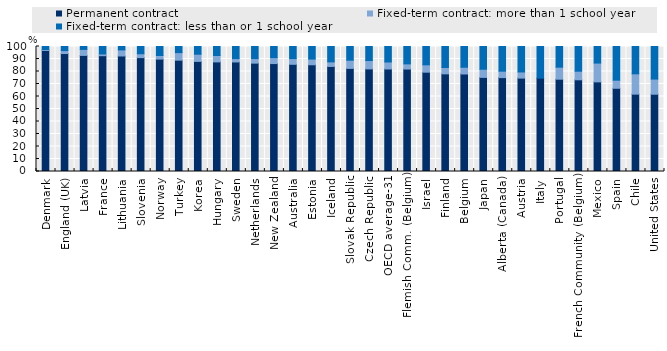
| Category | Permanent contract | Fixed-term contract: more than 1 school year | Fixed-term contract: less than or 1 school year |
|---|---|---|---|
| Denmark | 96.841 | 0.744 | 2.414 |
| England (UK) | 94.371 | 2.346 | 3.282 |
| Latvia | 92.878 | 4.8 | 2.322 |
| France | 92.647 | 1.362 | 5.991 |
| Lithuania | 92.425 | 4.855 | 2.721 |
| Slovenia | 91.095 | 3.094 | 5.811 |
| Norway | 89.931 | 2.869 | 7.2 |
| Turkey | 89.066 | 6.029 | 4.905 |
| Korea | 88.087 | 5.735 | 6.179 |
| Hungary | 87.682 | 5.118 | 7.2 |
| Sweden | 87.63 | 2.702 | 9.668 |
| Netherlands | 86.676 | 3.675 | 9.65 |
| New Zealand | 86.355 | 4.751 | 8.894 |
| Australia | 85.765 | 4.574 | 9.661 |
| Estonia | 85.378 | 4.577 | 10.045 |
| Iceland | 84.048 | 3.653 | 12.299 |
| Slovak Republic | 82.466 | 6.571 | 10.963 |
| Czech Republic | 82.079 | 6.671 | 11.25 |
| OECD average-31 | 82.017 | 5.6 | 12.384 |
| Flemish Comm. (Belgium) | 81.967 | 4.136 | 13.897 |
| Israel | 79.454 | 5.88 | 14.666 |
| Finland | 78.123 | 5.088 | 16.789 |
| Belgium | 78.004 | 5.396 | 16.6 |
| Japan | 75.291 | 6.513 | 18.196 |
| Alberta (Canada) | 75.125 | 5.13 | 19.745 |
| Austria | 74.718 | 4.914 | 20.369 |
| Italy | 74.673 | 0 | 25.327 |
| Portugal | 73.837 | 9.624 | 16.54 |
| French Community (Belgium) | 73.37 | 6.87 | 19.76 |
| Mexico | 71.695 | 15.047 | 13.258 |
| Spain | 66.579 | 6.465 | 26.956 |
| Chile | 61.885 | 16.256 | 21.86 |
| United States | 61.816 | 12.121 | 26.062 |